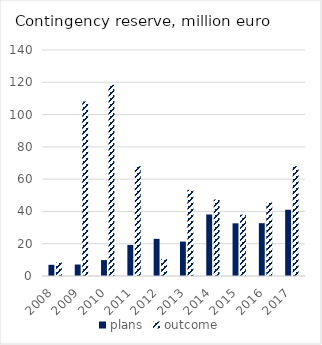
| Category | plans | outcome |
|---|---|---|
| 2008.0 | 6.936 | 8.359 |
| 2009.0 | 7.114 | 108.107 |
| 2010.0 | 9.865 | 118.475 |
| 2011.0 | 19.243 | 68.096 |
| 2012.0 | 23.027 | 10.564 |
| 2013.0 | 21.322 | 53.349 |
| 2014.0 | 38.099 | 47.38 |
| 2015.0 | 32.643 | 38.064 |
| 2016.0 | 32.717 | 45.554 |
| 2017.0 | 41.035 | 68.021 |